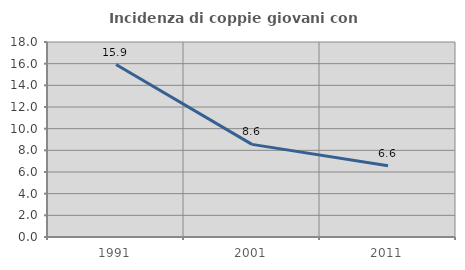
| Category | Incidenza di coppie giovani con figli |
|---|---|
| 1991.0 | 15.916 |
| 2001.0 | 8.551 |
| 2011.0 | 6.574 |